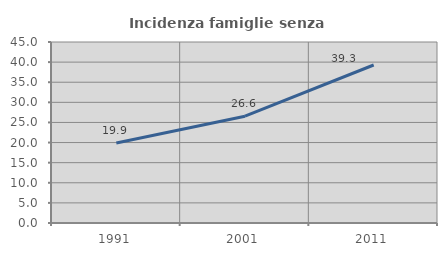
| Category | Incidenza famiglie senza nuclei |
|---|---|
| 1991.0 | 19.869 |
| 2001.0 | 26.562 |
| 2011.0 | 39.28 |